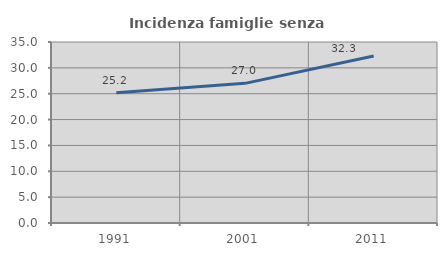
| Category | Incidenza famiglie senza nuclei |
|---|---|
| 1991.0 | 25.164 |
| 2001.0 | 27.005 |
| 2011.0 | 32.295 |